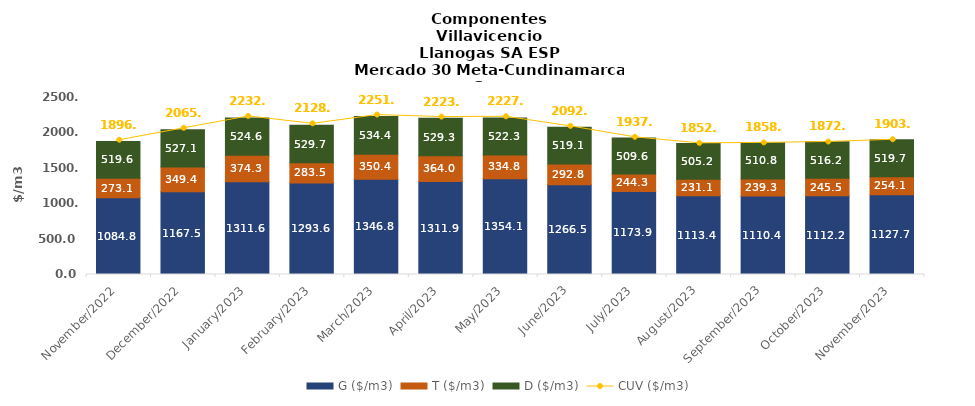
| Category | G ($/m3) | T ($/m3) | D ($/m3) |
|---|---|---|---|
| 2022-11-01 | 1084.79 | 273.13 | 519.57 |
| 2022-12-01 | 1167.54 | 349.4 | 527.09 |
| 2023-01-01 | 1311.57 | 374.33 | 524.58 |
| 2023-02-01 | 1293.59 | 283.45 | 529.74 |
| 2023-03-01 | 1346.83 | 350.38 | 534.44 |
| 2023-04-01 | 1311.89 | 364.02 | 529.26 |
| 2023-05-01 | 1354.14 | 334.83 | 522.32 |
| 2023-06-01 | 1266.52 | 292.77 | 519.06 |
| 2023-07-01 | 1173.91 | 244.29 | 509.62 |
| 2023-08-01 | 1113.38 | 231.11 | 505.17 |
| 2023-09-01 | 1110.42 | 239.27 | 510.83 |
| 2023-10-01 | 1112.24 | 245.53 | 516.22 |
| 2023-11-01 | 1127.7 | 254.12 | 519.71 |